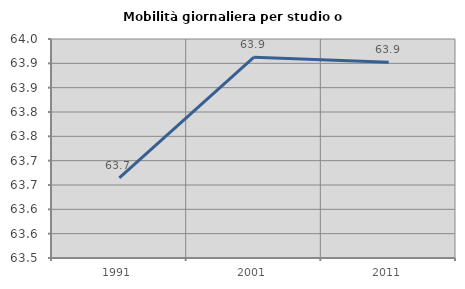
| Category | Mobilità giornaliera per studio o lavoro |
|---|---|
| 1991.0 | 63.665 |
| 2001.0 | 63.913 |
| 2011.0 | 63.902 |